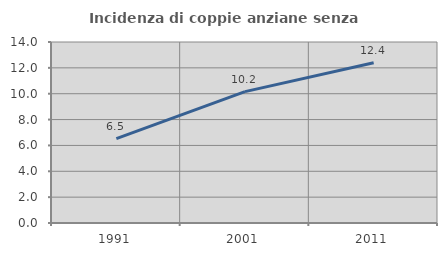
| Category | Incidenza di coppie anziane senza figli  |
|---|---|
| 1991.0 | 6.526 |
| 2001.0 | 10.164 |
| 2011.0 | 12.397 |